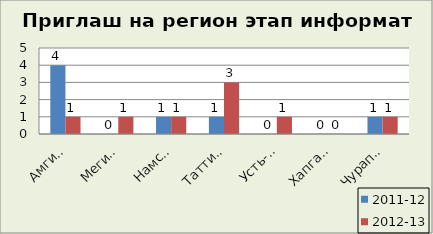
| Category | 2011-12 | 2012-13 |
|---|---|---|
| Амгинский | 4 | 1 |
| Мегино-Кангаласс | 0 | 1 |
| Намский | 1 | 1 |
| Таттинский | 1 | 3 |
| Усть-Алданский | 0 | 1 |
| Хапгаласский | 0 | 0 |
| Чурапчинский | 1 | 1 |